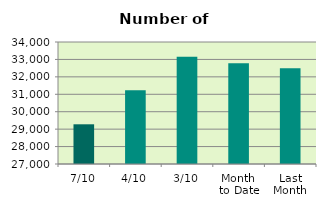
| Category | Series 0 |
|---|---|
| 7/10 | 29278 |
| 4/10 | 31230 |
| 3/10 | 33160 |
| Month 
to Date | 32776.4 |
| Last
Month | 32492.381 |